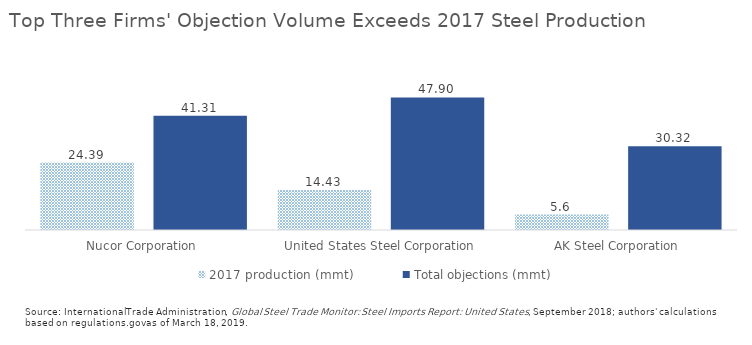
| Category | 2017 production (mmt) | Total objections (mmt) |
|---|---|---|
| Nucor Corporation | 24.39 | 41.313 |
| United States Steel Corporation | 14.43 | 47.899 |
| AK Steel Corporation | 5.6 | 30.316 |